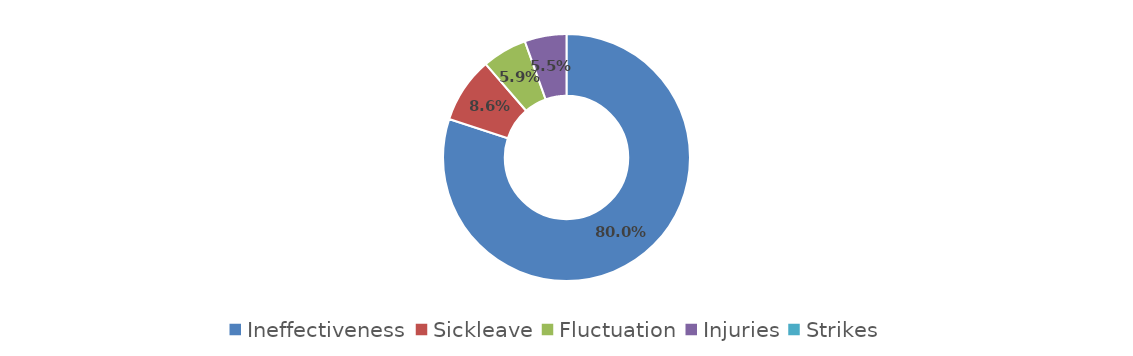
| Category | Series 0 |
|---|---|
| Ineffectiveness | 0.8 |
| Sickleave | 0.086 |
| Fluctuation | 0.059 |
| Injuries | 0.055 |
| Strikes | 0 |